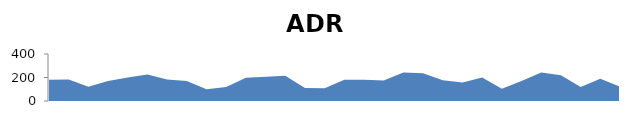
| Category | Series 0 |
|---|---|
| 0 | 180 |
| 1 | 183 |
| 2 | 120.459 |
| 3 | 170 |
| 4 | 201 |
| 5 | 226 |
| 6 | 183.286 |
| 7 | 170 |
| 8 | 101 |
| 9 | 120 |
| 10 | 197 |
| 11 | 207.221 |
| 12 | 215.072 |
| 13 | 111 |
| 14 | 109 |
| 15 | 181 |
| 16 | 180 |
| 17 | 174 |
| 18 | 243.585 |
| 19 | 236.169 |
| 20 | 176 |
| 21 | 158 |
| 22 | 200.52 |
| 23 | 105 |
| 24 | 171 |
| 25 | 243 |
| 26 | 218.211 |
| 27 | 119.089 |
| 28 | 190 |
| 29 | 122 |